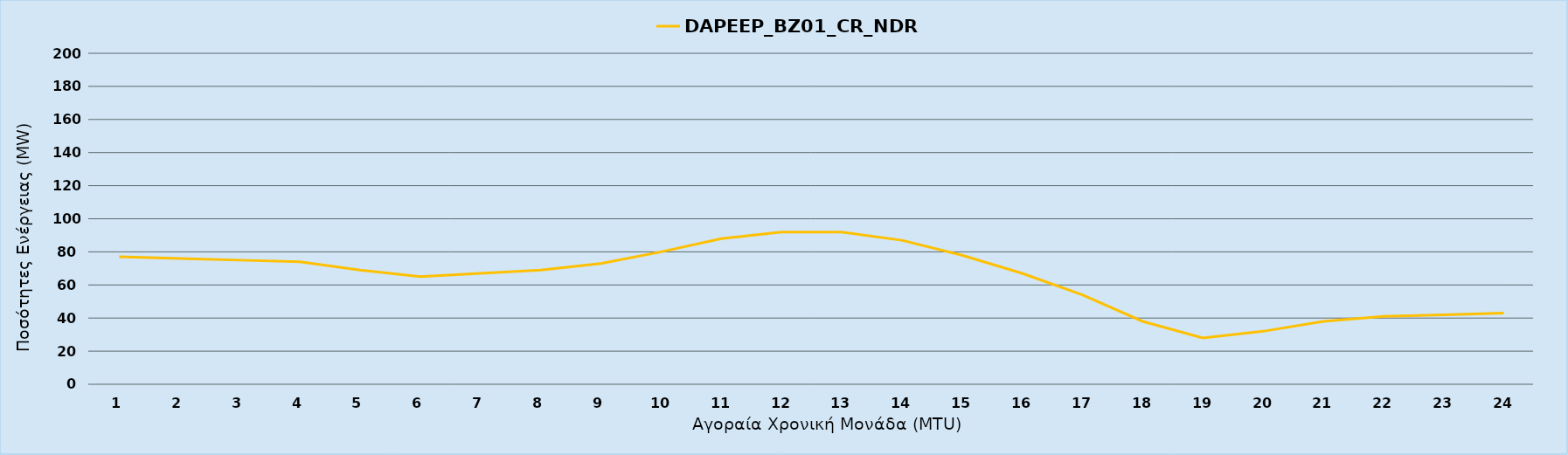
| Category | DAPEEP_BZ01_CR_NDR |
|---|---|
| 0 | 77 |
| 1 | 76 |
| 2 | 75 |
| 3 | 74 |
| 4 | 69 |
| 5 | 65 |
| 6 | 67 |
| 7 | 69 |
| 8 | 73 |
| 9 | 80 |
| 10 | 88 |
| 11 | 92 |
| 12 | 92 |
| 13 | 87 |
| 14 | 78 |
| 15 | 67 |
| 16 | 54 |
| 17 | 38 |
| 18 | 28 |
| 19 | 32 |
| 20 | 38 |
| 21 | 41 |
| 22 | 42 |
| 23 | 43 |